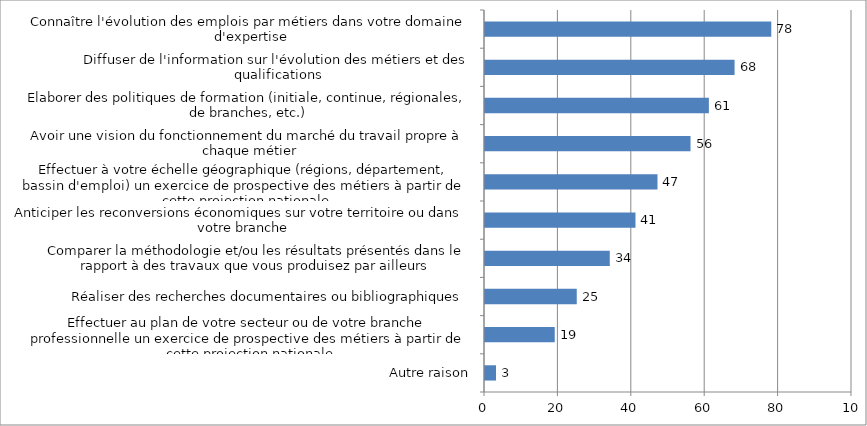
| Category | Series 0 |
|---|---|
| Autre raison | 3 |
| Effectuer au plan de votre secteur ou de votre branche professionnelle un exercice de prospective des métiers à partir de cette projection nationale | 19 |
| Réaliser des recherches documentaires ou bibliographiques | 25 |
| Comparer la méthodologie et/ou les résultats présentés dans le rapport à des travaux que vous produisez par ailleurs | 34 |
| Anticiper les reconversions économiques sur votre territoire ou dans votre branche | 41 |
| Effectuer à votre échelle géographique (régions, département, bassin d'emploi) un exercice de prospective des métiers à partir de cette projection nationale | 47 |
| Avoir une vision du fonctionnement du marché du travail propre à chaque métier | 56 |
| Elaborer des politiques de formation (initiale, continue, régionales, de branches, etc.) | 61 |
| Diffuser de l'information sur l'évolution des métiers et des qualifications | 68 |
| Connaître l'évolution des emplois par métiers dans votre domaine d'expertise | 78 |